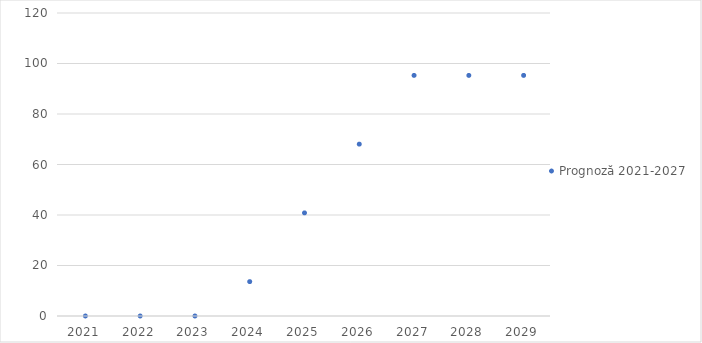
| Category | Prognoză 2021-2027 |
|---|---|
| 2021.0 | 0 |
| 2022.0 | 0 |
| 2023.0 | 0 |
| 2024.0 | 13.613 |
| 2025.0 | 40.839 |
| 2026.0 | 68.066 |
| 2027.0 | 95.292 |
| 2028.0 | 95.292 |
| 2029.0 | 95.292 |